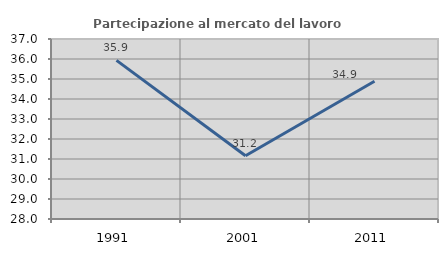
| Category | Partecipazione al mercato del lavoro  femminile |
|---|---|
| 1991.0 | 35.931 |
| 2001.0 | 31.159 |
| 2011.0 | 34.884 |